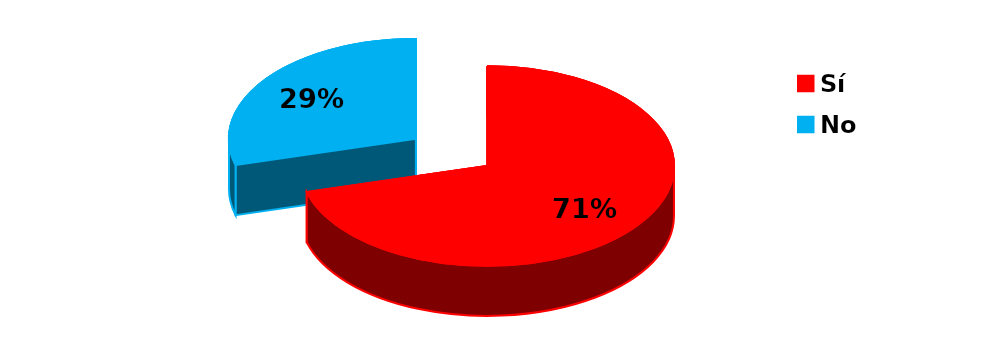
| Category | Series 0 |
|---|---|
| Sí | 92 |
| No | 38 |